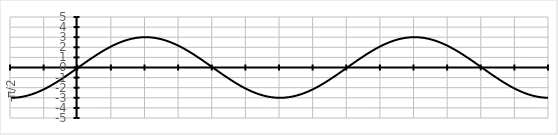
| Category | Series 0 |
|---|---|
| -π/2 | -3 |
|  | -3 |
|  | -2.998 |
|  | -2.996 |
|  | -2.993 |
|  | -2.989 |
|  | -2.984 |
|  | -2.978 |
|  | -2.971 |
|  | -2.963 |
|  | -2.954 |
|  | -2.945 |
|  | -2.934 |
|  | -2.923 |
|  | -2.911 |
|  | -2.898 |
|  | -2.884 |
|  | -2.869 |
|  | -2.853 |
|  | -2.837 |
|  | -2.819 |
|  | -2.801 |
|  | -2.782 |
|  | -2.762 |
|  | -2.741 |
|  | -2.719 |
|  | -2.696 |
|  | -2.673 |
|  | -2.649 |
|  | -2.624 |
|  | -2.598 |
|  | -2.572 |
|  | -2.544 |
|  | -2.516 |
|  | -2.487 |
|  | -2.457 |
|  | -2.427 |
|  | -2.396 |
|  | -2.364 |
|  | -2.331 |
|  | -2.298 |
|  | -2.264 |
|  | -2.229 |
|  | -2.194 |
|  | -2.158 |
|   | -2.121 |
|  | -2.084 |
|  | -2.046 |
|  | -2.007 |
|  | -1.968 |
|  | -1.928 |
|  | -1.888 |
|  | -1.847 |
|  | -1.805 |
|  | -1.763 |
|  | -1.721 |
|  | -1.678 |
|  | -1.634 |
|  | -1.59 |
|  | -1.545 |
|  | -1.5 |
|  | -1.454 |
|  | -1.408 |
|  | -1.362 |
|  | -1.315 |
|  | -1.268 |
|  | -1.22 |
|  | -1.172 |
|  | -1.124 |
|  | -1.075 |
|  | -1.026 |
|  | -0.977 |
|  | -0.927 |
|  | -0.877 |
|  | -0.827 |
|  | -0.776 |
|  | -0.726 |
|  | -0.675 |
|  | -0.624 |
|  | -0.572 |
|  | -0.521 |
|  | -0.469 |
|  | -0.418 |
|  | -0.366 |
|  | -0.314 |
|  | -0.261 |
|  | -0.209 |
|  | -0.157 |
|  | -0.105 |
|  | -0.052 |
| 0 | 0 |
|  | 0.052 |
|  | 0.105 |
|  | 0.157 |
|  | 0.209 |
|  | 0.261 |
|  | 0.314 |
|  | 0.366 |
|  | 0.418 |
|  | 0.469 |
|  | 0.521 |
|  | 0.572 |
|  | 0.624 |
|  | 0.675 |
|  | 0.726 |
|  | 0.776 |
|  | 0.827 |
|  | 0.877 |
|  | 0.927 |
|  | 0.977 |
|  | 1.026 |
|  | 1.075 |
|  | 1.124 |
|  | 1.172 |
|  | 1.22 |
|  | 1.268 |
|  | 1.315 |
|  | 1.362 |
|  | 1.408 |
|  | 1.454 |
|  | 1.5 |
|  | 1.545 |
|  | 1.59 |
|  | 1.634 |
|  | 1.678 |
|  | 1.721 |
|  | 1.763 |
|  | 1.805 |
|  | 1.847 |
|  | 1.888 |
|  | 1.928 |
|  | 1.968 |
|  | 2.007 |
|  | 2.046 |
|  | 2.084 |
|   | 2.121 |
|  | 2.158 |
|  | 2.194 |
|  | 2.229 |
|  | 2.264 |
|  | 2.298 |
|  | 2.331 |
|  | 2.364 |
|  | 2.396 |
|  | 2.427 |
|  | 2.457 |
|  | 2.487 |
|  | 2.516 |
|  | 2.544 |
|  | 2.572 |
|  | 2.598 |
|  | 2.624 |
|  | 2.649 |
|  | 2.673 |
|  | 2.696 |
|  | 2.719 |
|  | 2.741 |
|  | 2.762 |
|  | 2.782 |
|  | 2.801 |
|  | 2.819 |
|  | 2.837 |
|  | 2.853 |
|  | 2.869 |
|  | 2.884 |
|  | 2.898 |
|  | 2.911 |
|  | 2.923 |
|  | 2.934 |
|  | 2.945 |
|  | 2.954 |
|  | 2.963 |
|  | 2.971 |
|  | 2.978 |
|  | 2.984 |
|  | 2.989 |
|  | 2.993 |
|  | 2.996 |
|  | 2.998 |
|  | 3 |
| π/2 | 3 |
|  | 3 |
|  | 2.998 |
|  | 2.996 |
|  | 2.993 |
|  | 2.989 |
|  | 2.984 |
|  | 2.978 |
|  | 2.971 |
|  | 2.963 |
|  | 2.954 |
|  | 2.945 |
|  | 2.934 |
|  | 2.923 |
|  | 2.911 |
|  | 2.898 |
|  | 2.884 |
|  | 2.869 |
|  | 2.853 |
|  | 2.837 |
|  | 2.819 |
|  | 2.801 |
|  | 2.782 |
|  | 2.762 |
|  | 2.741 |
|  | 2.719 |
|  | 2.696 |
|  | 2.673 |
|  | 2.649 |
|  | 2.624 |
|  | 2.598 |
|  | 2.572 |
|  | 2.544 |
|  | 2.516 |
|  | 2.487 |
|  | 2.457 |
|  | 2.427 |
|  | 2.396 |
|  | 2.364 |
|  | 2.331 |
|  | 2.298 |
|  | 2.264 |
|  | 2.229 |
|  | 2.194 |
|  | 2.158 |
|   | 2.121 |
|  | 2.084 |
|  | 2.046 |
|  | 2.007 |
|  | 1.968 |
|  | 1.928 |
|  | 1.888 |
|  | 1.847 |
|  | 1.805 |
|  | 1.763 |
|  | 1.721 |
|  | 1.678 |
|  | 1.634 |
|  | 1.59 |
|  | 1.545 |
|  | 1.5 |
|  | 1.454 |
|  | 1.408 |
|  | 1.362 |
|  | 1.315 |
|  | 1.268 |
|  | 1.22 |
|  | 1.172 |
|  | 1.124 |
|  | 1.075 |
|  | 1.026 |
|  | 0.977 |
|  | 0.927 |
|  | 0.877 |
|  | 0.827 |
|  | 0.776 |
|  | 0.726 |
|  | 0.675 |
|  | 0.624 |
|  | 0.572 |
|  | 0.521 |
|  | 0.469 |
|  | 0.418 |
|  | 0.366 |
|  | 0.314 |
|  | 0.261 |
|  | 0.209 |
|  | 0.157 |
|  | 0.105 |
|  | 0.052 |
| π | 0 |
|  | -0.052 |
|  | -0.105 |
|  | -0.157 |
|  | -0.209 |
|  | -0.261 |
|  | -0.314 |
|  | -0.366 |
|  | -0.418 |
|  | -0.469 |
|  | -0.521 |
|  | -0.572 |
|  | -0.624 |
|  | -0.675 |
|  | -0.726 |
|  | -0.776 |
|  | -0.827 |
|  | -0.877 |
|  | -0.927 |
|  | -0.977 |
|  | -1.026 |
|  | -1.075 |
|  | -1.124 |
|  | -1.172 |
|  | -1.22 |
|  | -1.268 |
|  | -1.315 |
|  | -1.362 |
|  | -1.408 |
|  | -1.454 |
|  | -1.5 |
|  | -1.545 |
|  | -1.59 |
|  | -1.634 |
|  | -1.678 |
|  | -1.721 |
|  | -1.763 |
|  | -1.805 |
|  | -1.847 |
|  | -1.888 |
|  | -1.928 |
|  | -1.968 |
|  | -2.007 |
|  | -2.046 |
|  | -2.084 |
|   | -2.121 |
|  | -2.158 |
|  | -2.194 |
|  | -2.229 |
|  | -2.264 |
|  | -2.298 |
|  | -2.331 |
|  | -2.364 |
|  | -2.396 |
|  | -2.427 |
|  | -2.457 |
|  | -2.487 |
|  | -2.516 |
|  | -2.544 |
|  | -2.572 |
|  | -2.598 |
|  | -2.624 |
|  | -2.649 |
|  | -2.673 |
|  | -2.696 |
|  | -2.719 |
|  | -2.741 |
|  | -2.762 |
|  | -2.782 |
|  | -2.801 |
|  | -2.819 |
|  | -2.837 |
|  | -2.853 |
|  | -2.869 |
|  | -2.884 |
|  | -2.898 |
|  | -2.911 |
|  | -2.923 |
|  | -2.934 |
|  | -2.945 |
|  | -2.954 |
|  | -2.963 |
|  | -2.971 |
|  | -2.978 |
|  | -2.984 |
|  | -2.989 |
|  | -2.993 |
|  | -2.996 |
|  | -2.998 |
|  | -3 |
| 3π/2 | -3 |
|  | -3 |
|  | -2.998 |
|  | -2.996 |
|  | -2.993 |
|  | -2.989 |
|  | -2.984 |
|  | -2.978 |
|  | -2.971 |
|  | -2.963 |
|  | -2.954 |
|  | -2.945 |
|  | -2.934 |
|  | -2.923 |
|  | -2.911 |
|  | -2.898 |
|  | -2.884 |
|  | -2.869 |
|  | -2.853 |
|  | -2.837 |
|  | -2.819 |
|  | -2.801 |
|  | -2.782 |
|  | -2.762 |
|  | -2.741 |
|  | -2.719 |
|  | -2.696 |
|  | -2.673 |
|  | -2.649 |
|  | -2.624 |
|  | -2.598 |
|  | -2.572 |
|  | -2.544 |
|  | -2.516 |
|  | -2.487 |
|  | -2.457 |
|  | -2.427 |
|  | -2.396 |
|  | -2.364 |
|  | -2.331 |
|  | -2.298 |
|  | -2.264 |
|  | -2.229 |
|  | -2.194 |
|  | -2.158 |
|   | -2.121 |
|  | -2.084 |
|  | -2.046 |
|  | -2.007 |
|  | -1.968 |
|  | -1.928 |
|  | -1.888 |
|  | -1.847 |
|  | -1.805 |
|  | -1.763 |
|  | -1.721 |
|  | -1.678 |
|  | -1.634 |
|  | -1.59 |
|  | -1.545 |
|  | -1.5 |
|  | -1.454 |
|  | -1.408 |
|  | -1.362 |
|  | -1.315 |
|  | -1.268 |
|  | -1.22 |
|  | -1.172 |
|  | -1.124 |
|  | -1.075 |
|  | -1.026 |
|  | -0.977 |
|  | -0.927 |
|  | -0.877 |
|  | -0.827 |
|  | -0.776 |
|  | -0.726 |
|  | -0.675 |
|  | -0.624 |
|  | -0.572 |
|  | -0.521 |
|  | -0.469 |
|  | -0.418 |
|  | -0.366 |
|  | -0.314 |
|  | -0.261 |
|  | -0.209 |
|  | -0.157 |
|  | -0.105 |
|  | -0.052 |
| 2π | 0 |
|  | 0.052 |
|  | 0.105 |
|  | 0.157 |
|  | 0.209 |
|  | 0.261 |
|  | 0.314 |
|  | 0.366 |
|  | 0.418 |
|  | 0.469 |
|  | 0.521 |
|  | 0.572 |
|  | 0.624 |
|  | 0.675 |
|  | 0.726 |
|  | 0.776 |
|  | 0.827 |
|  | 0.877 |
|  | 0.927 |
|  | 0.977 |
|  | 1.026 |
|  | 1.075 |
|  | 1.124 |
|  | 1.172 |
|  | 1.22 |
|  | 1.268 |
|  | 1.315 |
|  | 1.362 |
|  | 1.408 |
|  | 1.454 |
|  | 1.5 |
|  | 1.545 |
|  | 1.59 |
|  | 1.634 |
|  | 1.678 |
|  | 1.721 |
|  | 1.763 |
|  | 1.805 |
|  | 1.847 |
|  | 1.888 |
|  | 1.928 |
|  | 1.968 |
|  | 2.007 |
|  | 2.046 |
|  | 2.084 |
|   | 2.121 |
|  | 2.158 |
|  | 2.194 |
|  | 2.229 |
|  | 2.264 |
|  | 2.298 |
|  | 2.331 |
|  | 2.364 |
|  | 2.396 |
|  | 2.427 |
|  | 2.457 |
|  | 2.487 |
|  | 2.516 |
|  | 2.544 |
|  | 2.572 |
|  | 2.598 |
|  | 2.624 |
|  | 2.649 |
|  | 2.673 |
|  | 2.696 |
|  | 2.719 |
|  | 2.741 |
|  | 2.762 |
|  | 2.782 |
|  | 2.801 |
|  | 2.819 |
|  | 2.837 |
|  | 2.853 |
|  | 2.869 |
|  | 2.884 |
|  | 2.898 |
|  | 2.911 |
|  | 2.923 |
|  | 2.934 |
|  | 2.945 |
|  | 2.954 |
|  | 2.963 |
|  | 2.971 |
|  | 2.978 |
|  | 2.984 |
|  | 2.989 |
|  | 2.993 |
|  | 2.996 |
|  | 2.998 |
|  | 3 |
| 5π/2 | 3 |
|  | 3 |
|  | 2.998 |
|  | 2.996 |
|  | 2.993 |
|  | 2.989 |
|  | 2.984 |
|  | 2.978 |
|  | 2.971 |
|  | 2.963 |
|  | 2.954 |
|  | 2.945 |
|  | 2.934 |
|  | 2.923 |
|  | 2.911 |
|  | 2.898 |
|  | 2.884 |
|  | 2.869 |
|  | 2.853 |
|  | 2.837 |
|  | 2.819 |
|  | 2.801 |
|  | 2.782 |
|  | 2.762 |
|  | 2.741 |
|  | 2.719 |
|  | 2.696 |
|  | 2.673 |
|  | 2.649 |
|  | 2.624 |
|  | 2.598 |
|  | 2.572 |
|  | 2.544 |
|  | 2.516 |
|  | 2.487 |
|  | 2.457 |
|  | 2.427 |
|  | 2.396 |
|  | 2.364 |
|  | 2.331 |
|  | 2.298 |
|  | 2.264 |
|  | 2.229 |
|  | 2.194 |
|  | 2.158 |
|   | 2.121 |
|  | 2.084 |
|  | 2.046 |
|  | 2.007 |
|  | 1.968 |
|  | 1.928 |
|  | 1.888 |
|  | 1.847 |
|  | 1.805 |
|  | 1.763 |
|  | 1.721 |
|  | 1.678 |
|  | 1.634 |
|  | 1.59 |
|  | 1.545 |
|  | 1.5 |
|  | 1.454 |
|  | 1.408 |
|  | 1.362 |
|  | 1.315 |
|  | 1.268 |
|  | 1.22 |
|  | 1.172 |
|  | 1.124 |
|  | 1.075 |
|  | 1.026 |
|  | 0.977 |
|  | 0.927 |
|  | 0.877 |
|  | 0.827 |
|  | 0.776 |
|  | 0.726 |
|  | 0.675 |
|  | 0.624 |
|  | 0.572 |
|  | 0.521 |
|  | 0.469 |
|  | 0.418 |
|  | 0.366 |
|  | 0.314 |
|  | 0.261 |
|  | 0.209 |
|  | 0.157 |
|  | 0.105 |
|  | 0.052 |
| 3π | 0 |
|  | -0.052 |
|  | -0.105 |
|  | -0.157 |
|  | -0.209 |
|  | -0.261 |
|  | -0.314 |
|  | -0.366 |
|  | -0.418 |
|  | -0.469 |
|  | -0.521 |
|  | -0.572 |
|  | -0.624 |
|  | -0.675 |
|  | -0.726 |
|  | -0.776 |
|  | -0.827 |
|  | -0.877 |
|  | -0.927 |
|  | -0.977 |
|  | -1.026 |
|  | -1.075 |
|  | -1.124 |
|  | -1.172 |
|  | -1.22 |
|  | -1.268 |
|  | -1.315 |
|  | -1.362 |
|  | -1.408 |
|  | -1.454 |
|  | -1.5 |
|  | -1.545 |
|  | -1.59 |
|  | -1.634 |
|  | -1.678 |
|  | -1.721 |
|  | -1.763 |
|  | -1.805 |
|  | -1.847 |
|  | -1.888 |
|  | -1.928 |
|  | -1.968 |
|  | -2.007 |
|  | -2.046 |
|  | -2.084 |
|   | -2.121 |
|  | -2.158 |
|  | -2.194 |
|  | -2.229 |
|  | -2.264 |
|  | -2.298 |
|  | -2.331 |
|  | -2.364 |
|  | -2.396 |
|  | -2.427 |
|  | -2.457 |
|  | -2.487 |
|  | -2.516 |
|  | -2.544 |
|  | -2.572 |
|  | -2.598 |
|  | -2.624 |
|  | -2.649 |
|  | -2.673 |
|  | -2.696 |
|  | -2.719 |
|  | -2.741 |
|  | -2.762 |
|  | -2.782 |
|  | -2.801 |
|  | -2.819 |
|  | -2.837 |
|  | -2.853 |
|  | -2.869 |
|  | -2.884 |
|  | -2.898 |
|  | -2.911 |
|  | -2.923 |
|  | -2.934 |
|  | -2.945 |
|  | -2.954 |
|  | -2.963 |
|  | -2.971 |
|  | -2.978 |
|  | -2.984 |
|  | -2.989 |
|  | -2.993 |
|  | -2.996 |
|  | -2.998 |
|  | -3 |
| 7π/2 | -3 |